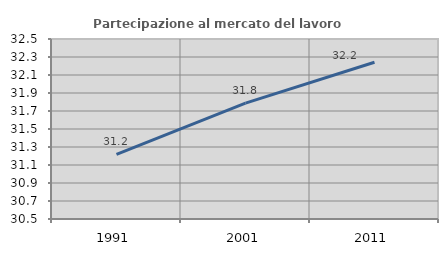
| Category | Partecipazione al mercato del lavoro  femminile |
|---|---|
| 1991.0 | 31.218 |
| 2001.0 | 31.788 |
| 2011.0 | 32.242 |